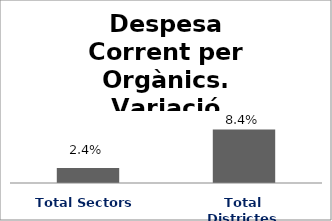
| Category | Series 0 |
|---|---|
| Total Sectors | 0.024 |
| Total Districtes | 0.084 |